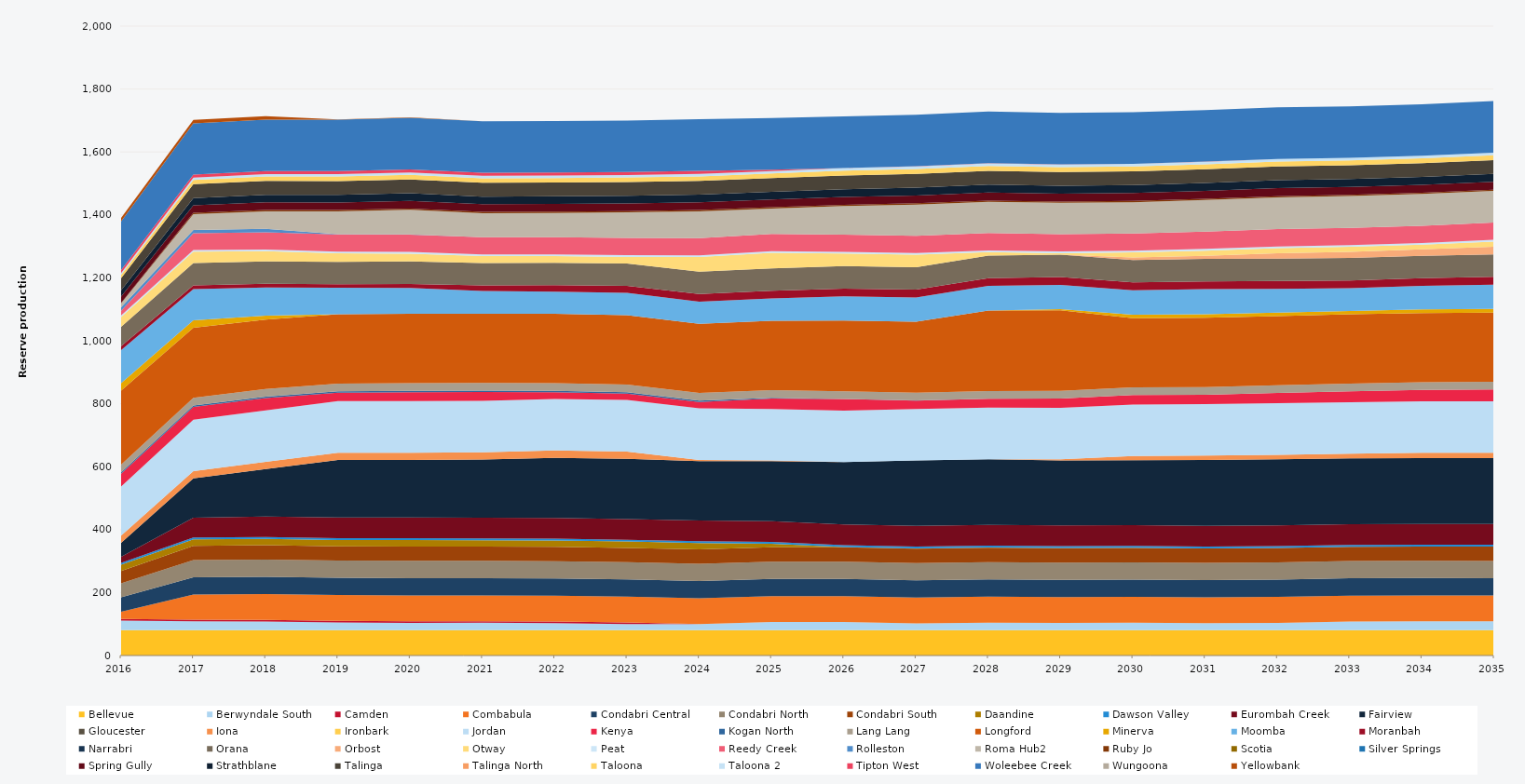
| Category | Bellevue | Berwyndale South | Camden | Combabula | Condabri Central | Condabri North | Condabri South | Daandine | Dawson Valley | Eurombah Creek | Fairview | Gloucester | Iona | Ironbark | Jordan | Kenya | Kogan North | Lang Lang | Longford | Minerva | Moomba | Moranbah | Narrabri | Orana | Orbost | Otway | Peat | Reedy Creek | Rolleston | Roma Hub2 | Ruby Jo | Scotia | Silver Springs | Spring Gully | Strathblane | Talinga | Talinga North | Taloona | Taloona 2 | Tipton West | Woleebee Creek | Wungoona | Yellowbank |
|---|---|---|---|---|---|---|---|---|---|---|---|---|---|---|---|---|---|---|---|---|---|---|---|---|---|---|---|---|---|---|---|---|---|---|---|---|---|---|---|---|---|---|---|
| 2016 | 80.52 | 30.616 | 5 | 22.655 | 46.015 | 44.735 | 39.125 | 20.13 | 5.856 | 18.809 | 44.182 | 0 | 23.12 | 0 | 156.313 | 40.548 | 4.392 | 24.522 | 235.041 | 23.79 | 105 | 12.808 | 0 | 61.27 | 0 | 30.83 | 5.49 | 14.418 | 10.98 | 13.095 | 1.283 | 0 | 0 | 19.836 | 20.026 | 38.297 | 0 | 10.733 | 6.135 | 9.516 | 154.385 | 0 | 10.978 |
| 2017 | 80.3 | 28.513 | 5 | 79.78 | 54.75 | 54.75 | 45.625 | 20.075 | 5.84 | 63.558 | 124.329 | 0 | 23.12 | 0 | 163.363 | 40.915 | 4.38 | 24.455 | 222.562 | 23.725 | 98.901 | 12.264 | 0 | 71.175 | 0 | 35.86 | 5.475 | 52.757 | 10.95 | 49.632 | 4.899 | 0 | 0 | 23.494 | 23.179 | 43.8 | 0 | 13.379 | 7.44 | 9.49 | 163.377 | 0 | 10.945 |
| 2018 | 80.3 | 27.749 | 5 | 82.068 | 54.75 | 54.75 | 45.625 | 20.075 | 5.84 | 65.591 | 150.806 | 0 | 23.12 | 0 | 163.345 | 39.162 | 4.38 | 24.455 | 220 | 13.235 | 89.065 | 11.816 | 0 | 71.175 | 0 | 32.361 | 5.475 | 54.702 | 10.948 | 55.134 | 4.899 | 0 | 0 | 24.173 | 23.969 | 43.8 | 0 | 14.457 | 7.61 | 9.49 | 163.395 | 0 | 10.943 |
| 2019 | 80.3 | 24.583 | 5 | 82.125 | 54.75 | 54.75 | 45.625 | 20.075 | 5.84 | 65.7 | 182.711 | 0 | 23.12 | 0 | 163.698 | 27.125 | 4.38 | 24.455 | 220 | 0 | 84.081 | 11.387 | 0 | 71.175 | 0 | 26.861 | 5.475 | 54.75 | 0.524 | 72.774 | 4.139 | 0 | 0 | 24.18 | 24.27 | 43.8 | 0 | 14.357 | 7.681 | 9.49 | 163.803 | 0 | 0.547 |
| 2020 | 80.52 | 23.062 | 5 | 82.35 | 54.9 | 54.9 | 45.75 | 20.13 | 5.856 | 65.88 | 182.894 | 0 | 23.12 | 0 | 164.164 | 28.285 | 4.392 | 24.522 | 220 | 0 | 81.906 | 12.87 | 0 | 71.37 | 0 | 24.967 | 5.49 | 54.9 | 0.93 | 78.085 | 4.139 | 0 | 0 | 24.157 | 24.259 | 43.92 | 0 | 14.57 | 7.749 | 9.516 | 164.22 | 0 | 1.07 |
| 2021 | 80.3 | 23.743 | 5 | 82.125 | 54.75 | 54.75 | 45.625 | 20.075 | 5.84 | 65.7 | 184.639 | 0 | 23.12 | 0 | 163.777 | 27.672 | 4.38 | 24.455 | 220 | 0 | 72.101 | 17.648 | 0 | 71.175 | 0 | 22.367 | 5.475 | 54.75 | 0 | 76.152 | 4.119 | 0 | 0 | 24.08 | 24.261 | 43.8 | 0 | 14.664 | 7.683 | 9.49 | 163.716 | 0 | 0 |
| 2022 | 80.3 | 22.658 | 5 | 82.125 | 54.75 | 54.75 | 45.625 | 20.075 | 5.84 | 65.7 | 191.356 | 0 | 23.12 | 0 | 163.795 | 21.663 | 4.38 | 24.455 | 220 | 0 | 70.624 | 20.656 | 0 | 71.175 | 0 | 20.997 | 5.475 | 54.75 | 0 | 77.131 | 4.097 | 0 | 0 | 24.35 | 24.317 | 43.8 | 0 | 14.328 | 7.812 | 9.49 | 163.676 | 0 | 0 |
| 2023 | 80.3 | 19.448 | 5 | 82.125 | 54.75 | 54.75 | 45.625 | 20.075 | 5.84 | 65.7 | 191.434 | 0 | 23.12 | 0 | 163.681 | 20.497 | 4.38 | 24.455 | 220 | 0 | 70.977 | 22.379 | 0 | 71.175 | 0 | 20.864 | 5.475 | 54.75 | 0 | 81.3 | 4.075 | 0 | 0 | 24.366 | 24.229 | 43.8 | 0 | 14.541 | 7.539 | 9.49 | 163.768 | 0 | 0 |
| 2024 | 80.52 | 18.982 | 0 | 82.35 | 54.9 | 54.9 | 45.75 | 20.13 | 5.856 | 65.88 | 188.672 | 0 | 3.414 | 0 | 164.131 | 19.842 | 4.392 | 24.522 | 220 | 0 | 70.113 | 24.211 | 0 | 71.37 | 0 | 45.98 | 5.49 | 54.9 | 0 | 85.119 | 4.053 | 0 | 0 | 24.292 | 24.422 | 43.92 | 0 | 14.296 | 7.693 | 9.516 | 164.179 | 0 | 0 |
| 2025 | 80.3 | 26.441 | 0 | 82.125 | 54.75 | 54.75 | 45.625 | 10.949 | 5.84 | 65.7 | 191.257 | 0 | 1.886 | 0 | 163.7 | 33.25 | 2.391 | 24.455 | 220 | 0 | 70.913 | 24.798 | 0 | 71.175 | 0 | 48.95 | 5.475 | 54.75 | 0 | 80.84 | 4.031 | 0 | 0 | 24.384 | 24.515 | 43.8 | 0 | 14.599 | 7.435 | 4.826 | 163.706 | 0 | 0 |
| 2026 | 80.3 | 26.088 | 0 | 82.125 | 54.75 | 54.75 | 45.625 | 1.021 | 5.84 | 65.7 | 198.177 | 0 | 0 | 0 | 163.732 | 36.865 | 0.168 | 24.455 | 224.458 | 0 | 77.121 | 24.82 | 0 | 71.175 | 0 | 40.214 | 5.475 | 54.75 | 0 | 90.43 | 4.008 | 0 | 0 | 24.818 | 24.823 | 43.8 | 0 | 15.065 | 8.132 | 0.411 | 163.652 | 0 | 0 |
| 2027 | 80.3 | 21.829 | 0 | 82.125 | 54.75 | 54.75 | 45.625 | 0.971 | 5.84 | 65.7 | 207.741 | 0 | 0 | 0 | 163.772 | 26.848 | 0.229 | 24.455 | 225.398 | 0 | 77.354 | 24.82 | 0 | 71.175 | 0 | 39.96 | 5.475 | 54.75 | 0 | 98.966 | 3.986 | 0 | 0 | 25.083 | 24.987 | 43.8 | 0 | 15.246 | 8.279 | 0.4 | 163.59 | 0 | 0 |
| 2028 | 80.52 | 24.095 | 0 | 82.35 | 54.9 | 54.9 | 45.75 | 0.895 | 5.856 | 65.88 | 208.368 | 0 | 0 | 0 | 164.091 | 28.022 | 0.221 | 24.522 | 255.681 | 0 | 78.156 | 24.888 | 0 | 71.37 | 0 | 11.395 | 5.49 | 54.9 | 0 | 99.388 | 3.964 | 0 | 0 | 25.209 | 25.174 | 43.92 | 0 | 15.305 | 8.359 | 0.485 | 164.13 | 0 | 0 |
| 2029 | 80.3 | 23.209 | 0 | 82.125 | 54.75 | 54.75 | 45.625 | 0.946 | 5.84 | 65.7 | 206.782 | 0 | 3.19 | 0 | 163.662 | 29.533 | 0.191 | 24.455 | 255.966 | 3.853 | 76.869 | 24.82 | 0 | 71.175 | 0.114 | 4.453 | 5.475 | 54.75 | 0 | 99.925 | 3.942 | 0 | 0 | 25.185 | 25.174 | 43.8 | 0 | 15.326 | 8.391 | 0.463 | 163.656 | 0 | 0 |
| 2030 | 80.3 | 23.912 | 0 | 82.125 | 54.75 | 54.75 | 45.625 | 0.995 | 5.84 | 65.7 | 206.623 | 0 | 13.45 | 0 | 163.632 | 29.685 | 0.191 | 24.455 | 220 | 10.772 | 78.028 | 24.82 | 0 | 71.175 | 7.869 | 16.271 | 5.475 | 54.75 | 0 | 99.211 | 3.92 | 0 | 0 | 25.149 | 25.129 | 43.8 | 0 | 15.294 | 8.351 | 0.414 | 163.665 | 0 | 0 |
| 2031 | 80.3 | 22.533 | 0 | 82.125 | 54.75 | 54.75 | 45.625 | 0.172 | 5.84 | 65.7 | 209.382 | 0 | 14.147 | 0 | 163.675 | 29.396 | 0.077 | 24.455 | 220 | 11.452 | 79.78 | 24.82 | 0 | 71.175 | 9.901 | 16.544 | 5.475 | 54.75 | 0 | 100.53 | 3.898 | 0 | 0 | 25.185 | 25.177 | 43.8 | 0 | 15.33 | 8.394 | 0.145 | 163.6 | 0 | 0 |
| 2032 | 80.52 | 23.272 | 0 | 82.35 | 54.9 | 54.9 | 45.75 | 0.095 | 5.856 | 65.88 | 209.817 | 0 | 13.998 | 0 | 164.137 | 32.503 | 0.005 | 24.522 | 220 | 10.888 | 75.485 | 24.888 | 0 | 71.37 | 16.96 | 16.263 | 5.49 | 54.9 | 0 | 101.053 | 3.876 | 0 | 0 | 25.254 | 25.254 | 43.92 | 0 | 15.372 | 8.418 | 0.035 | 163.998 | 0 | 0 |
| 2033 | 80.3 | 28.022 | 0 | 82.125 | 54.75 | 54.75 | 45.625 | 0.09 | 5.84 | 65.7 | 209.476 | 0 | 14.535 | 0 | 163.689 | 34.636 | 0.007 | 24.455 | 220 | 10.952 | 72.142 | 24.82 | 0 | 71.175 | 19.589 | 16.179 | 5.475 | 54.75 | 0 | 100.73 | 3.854 | 0 | 0 | 25.185 | 25.185 | 43.8 | 0 | 15.33 | 8.395 | 0.005 | 163.542 | 0 | 0 |
| 2034 | 80.3 | 28.761 | 0 | 82.125 | 54.75 | 54.75 | 45.625 | 0.124 | 5.84 | 65.7 | 209.451 | 0 | 16.592 | 0 | 163.68 | 36.102 | 0.049 | 24.455 | 220 | 11.388 | 74.521 | 24.82 | 0 | 71.175 | 20.617 | 14.558 | 5.475 | 54.75 | 0 | 100.755 | 3.831 | 0 | 0 | 25.185 | 25.185 | 43.8 | 0 | 15.33 | 8.395 | 0.015 | 163.53 | 0 | 0 |
| 2035 | 80.3 | 28.734 | 0 | 82.125 | 54.75 | 54.75 | 45.625 | 0.213 | 5.84 | 65.7 | 209.549 | 0 | 16.497 | 0 | 163.497 | 37.618 | 0.036 | 24.455 | 220 | 11.447 | 77.421 | 24.82 | 0 | 71.175 | 24.713 | 16.268 | 5.475 | 54.75 | 0 | 100.757 | 3.604 | 0 | 0 | 25.185 | 25.185 | 43.8 | 0 | 15.33 | 8.395 | 0.064 | 163.589 | 0 | 0 |